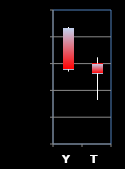
| Category | Series 0 | Series 1 | Series 2 | Series 3 |
|---|---|---|---|---|
| Y | 3.316 | 3.318 | 3.236 | 3.239 |
| T | 3.25 | 3.261 | 3.182 | 3.232 |